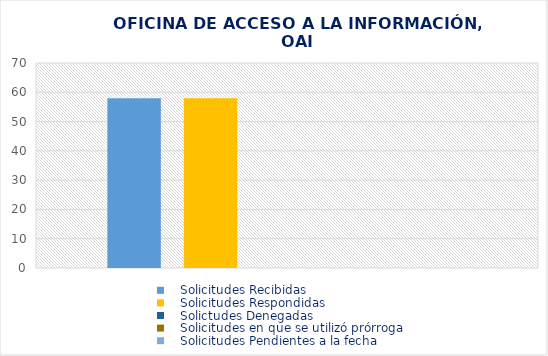
| Category |    Solicitudes Recibidas |    Solicitudes Respondidas |    Solictudes Denegadas |    Solicitudes en que se utilizó prórroga |    Solicitudes Pendientes a la fecha |
|---|---|---|---|---|---|
| 0 | 58 | 58 | 0 | 0 | 0 |